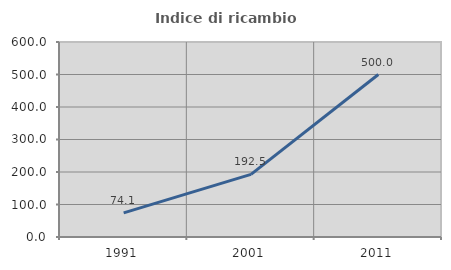
| Category | Indice di ricambio occupazionale  |
|---|---|
| 1991.0 | 74.074 |
| 2001.0 | 192.5 |
| 2011.0 | 500 |